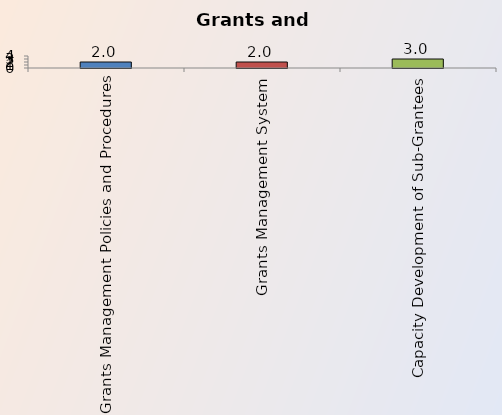
| Category | Series 0 |
|---|---|
| Grants Management Policies and Procedures | 2 |
| Grants Management System | 2 |
| Capacity Development of Sub-Grantees | 3 |